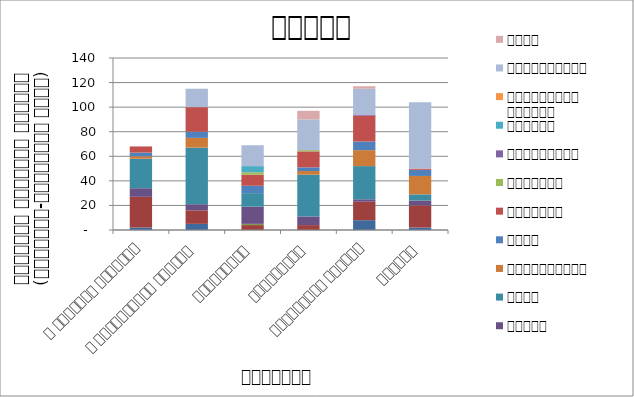
| Category | सुरक्षा | राजनीति | आन्दोलन | न्याय | शासन | अर्थतन्त्र | समाज | कुटनीति | वातावरण | स्वास्थ्य  | शिक्षा | प्राकृतिक प्रकोप | भ्रष्टाचार | अन्य |
|---|---|---|---|---|---|---|---|---|---|---|---|---|---|---|
| द हिमालयन टाइम्स् | 2 | 25 | 0 | 7 | 24 | 2 | 3 | 5 | 0 | 0 | 0 | 0 | 0 | 0 |
| द काठमाण्डौं पोस्ट् | 5 | 11 | 0 | 5 | 46 | 8 | 5 | 20 | 0 | 0 | 0 | 0 | 15 | 0 |
| रिपब्लिका | 0 | 4 | 1 | 14 | 11 | 0 | 6 | 9 | 2 | 0 | 5 | 0 | 17 | 0 |
| कान्तिपुर | 0 | 4 | 0 | 7 | 34 | 3 | 3 | 13 | 1 | 0 | 0 | 0 | 25 | 7 |
| अन्नपूर्ण पोस्ट् | 8 | 15 | 0 | 2 | 27 | 13 | 7 | 21 | 0 | 1 | 0 | 0 | 21 | 2 |
| नागरिक | 2 | 18 | 0 | 4 | 5 | 15 | 5 | 1 | 0 | 0 | 0 | 0 | 54 | 0 |